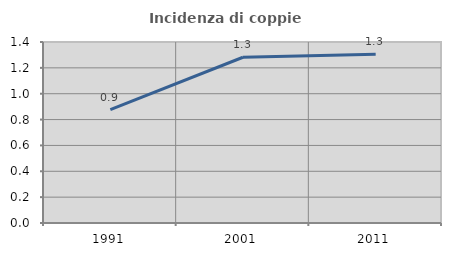
| Category | Incidenza di coppie miste |
|---|---|
| 1991.0 | 0.877 |
| 2001.0 | 1.282 |
| 2011.0 | 1.304 |